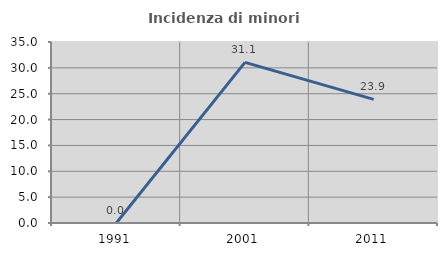
| Category | Incidenza di minori stranieri |
|---|---|
| 1991.0 | 0 |
| 2001.0 | 31.068 |
| 2011.0 | 23.899 |